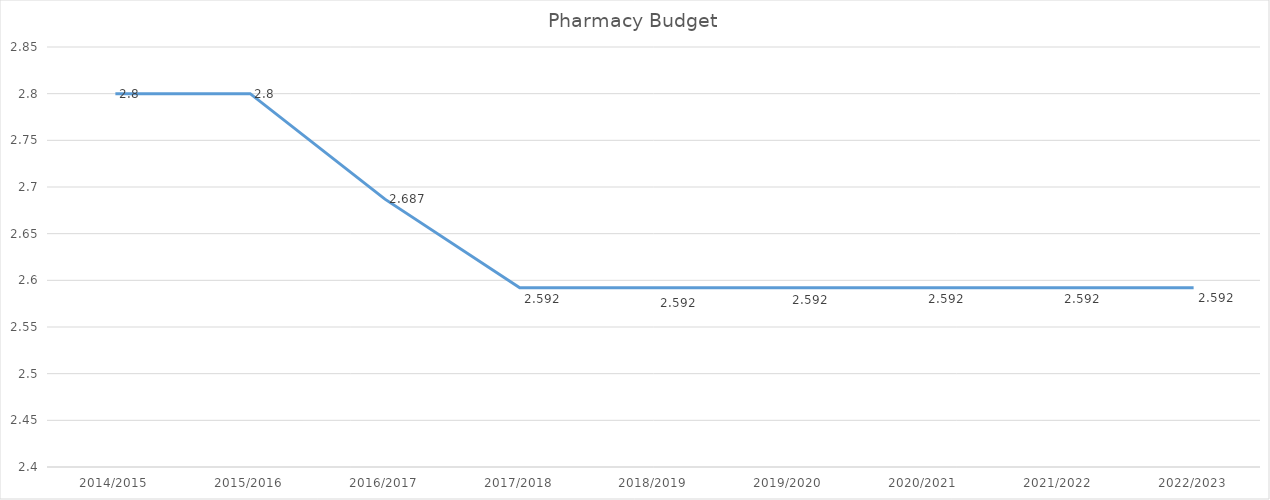
| Category | Pharmacy Budget |
|---|---|
| 2014/2015 | 2.8 |
| 2015/2016 | 2.8 |
| 2016/2017 | 2.687 |
| 2017/2018 | 2.592 |
| 2018/2019 | 2.592 |
| 2019/2020 | 2.592 |
| 2020/2021 | 2.592 |
| 2021/2022 | 2.592 |
| 2022/2023 | 2.592 |